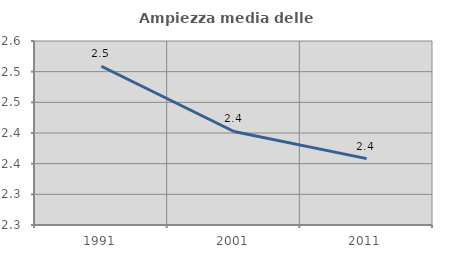
| Category | Ampiezza media delle famiglie |
|---|---|
| 1991.0 | 2.509 |
| 2001.0 | 2.402 |
| 2011.0 | 2.358 |